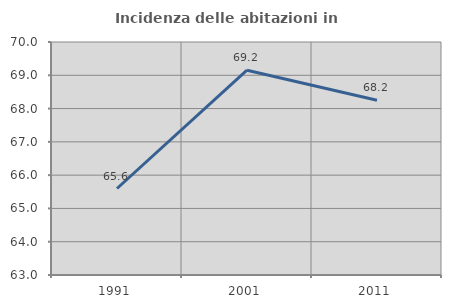
| Category | Incidenza delle abitazioni in proprietà  |
|---|---|
| 1991.0 | 65.598 |
| 2001.0 | 69.153 |
| 2011.0 | 68.248 |